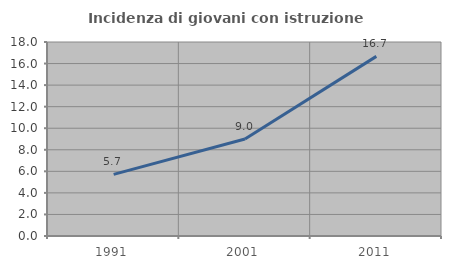
| Category | Incidenza di giovani con istruzione universitaria |
|---|---|
| 1991.0 | 5.714 |
| 2001.0 | 9 |
| 2011.0 | 16.667 |